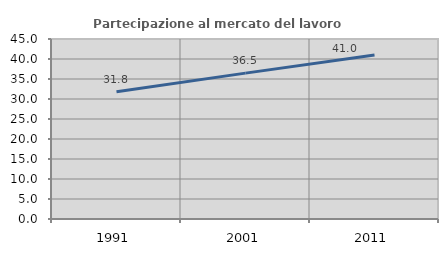
| Category | Partecipazione al mercato del lavoro  femminile |
|---|---|
| 1991.0 | 31.838 |
| 2001.0 | 36.467 |
| 2011.0 | 40.979 |